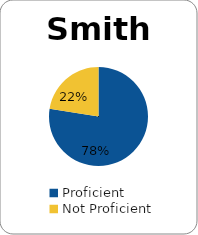
| Category | Series 0 |
|---|---|
| Proficient | 0.775 |
| Not Proficient | 0.225 |